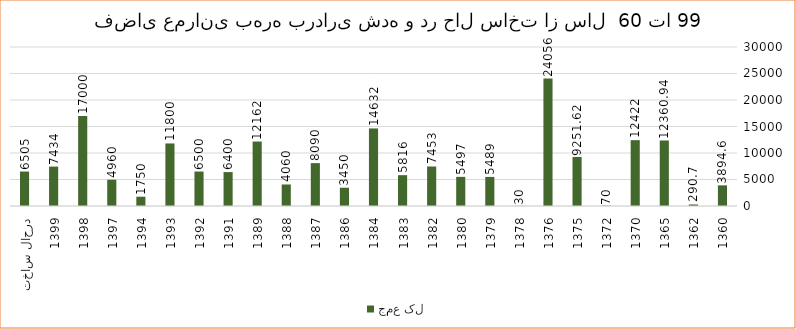
| Category | جمع کل |
|---|---|
| 1360 | 3894.6 |
| 1362 | 290.7 |
| 1365 | 12360.94 |
| 1370 | 12422 |
| 1372 | 70 |
| 1375 | 9251.62 |
| 1376 | 24056 |
| 1378 | 30 |
| 1379 | 5489 |
| 1380 | 5497 |
| 1382 | 7453 |
| 1383 | 5816 |
| 1384 | 14632 |
| 1386 | 3450 |
| 1387 | 8090 |
| 1388 | 4060 |
| 1389 | 12162 |
| 1391 | 6400 |
| 1392 | 6500 |
| 1393 | 11800 |
| 1394 | 1750 |
| 1397 | 4960 |
| 1398 | 17000 |
| 1399 | 7434 |
| درحال ساخت | 6505 |